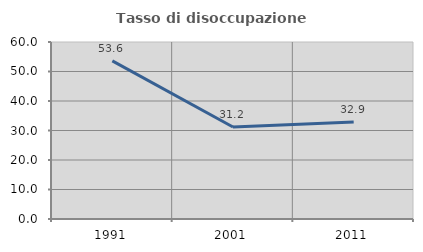
| Category | Tasso di disoccupazione giovanile  |
|---|---|
| 1991.0 | 53.614 |
| 2001.0 | 31.169 |
| 2011.0 | 32.857 |